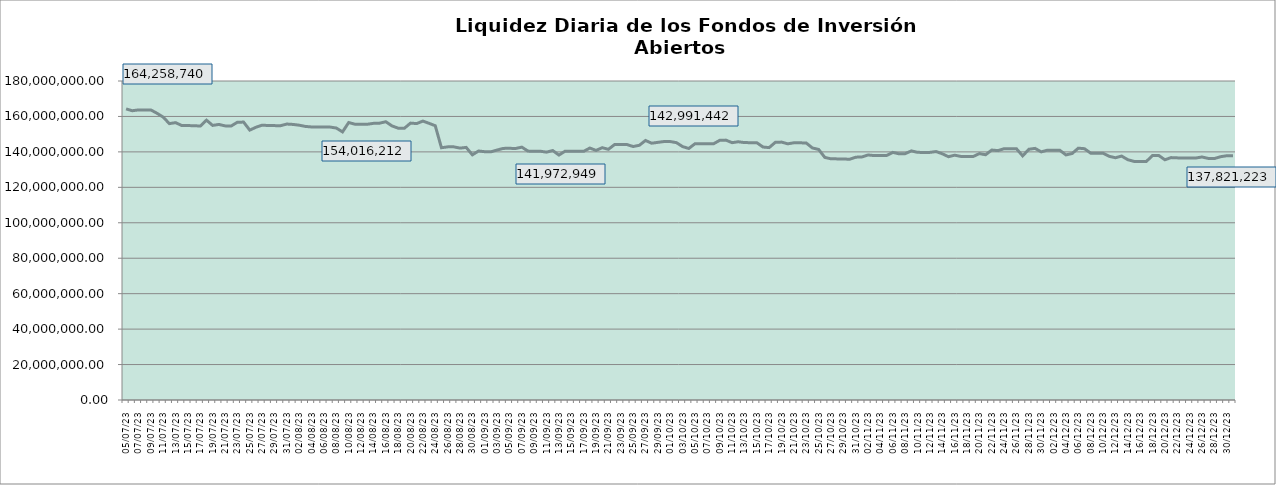
| Category | Series 0 |
|---|---|
| 2023-07-05 | 164258740.45 |
| 2023-07-06 | 163225492.89 |
| 2023-07-07 | 163682937.28 |
| 2023-07-08 | 163691432.8 |
| 2023-07-09 | 163674983.4 |
| 2023-07-10 | 161790090.35 |
| 2023-07-11 | 159601713.99 |
| 2023-07-12 | 155947864.72 |
| 2023-07-13 | 156507464.1 |
| 2023-07-14 | 154883237.61 |
| 2023-07-15 | 154825413.89 |
| 2023-07-16 | 154808876.89 |
| 2023-07-17 | 154556312.68 |
| 2023-07-18 | 157902648.41 |
| 2023-07-19 | 154934355.04 |
| 2023-07-20 | 155498336.32 |
| 2023-07-21 | 154680508.45 |
| 2023-07-22 | 154615108.13 |
| 2023-07-23 | 156728651.41 |
| 2023-07-24 | 156815251.25 |
| 2023-07-25 | 152281694.75 |
| 2023-07-26 | 153890695.42 |
| 2023-07-27 | 155092064.53 |
| 2023-07-28 | 154865658.11 |
| 2023-07-29 | 154820702.95 |
| 2023-07-30 | 154804127.61 |
| 2023-07-31 | 155710217.62 |
| 2023-08-01 | 155493472.47 |
| 2023-08-02 | 155056439.34 |
| 2023-08-03 | 154367288.64 |
| 2023-08-04 | 154063683.76 |
| 2023-08-05 | 154016212.26 |
| 2023-08-06 | 153998460.63 |
| 2023-08-07 | 154003206.59 |
| 2023-08-08 | 153463617.9 |
| 2023-08-09 | 151275983.56 |
| 2023-08-10 | 156557558.49 |
| 2023-08-11 | 155636284.33 |
| 2023-08-12 | 155608232.68 |
| 2023-08-13 | 155591304.7 |
| 2023-08-14 | 156102039.43 |
| 2023-08-15 | 156215343.69 |
| 2023-08-16 | 157010791.53 |
| 2023-08-17 | 154663923.56 |
| 2023-08-18 | 153387856.69 |
| 2023-08-19 | 153314384.31 |
| 2023-08-20 | 156238403.63 |
| 2023-08-21 | 155974720.3 |
| 2023-08-22 | 157393571.5 |
| 2023-08-23 | 156108673.19 |
| 2023-08-24 | 154755827.71 |
| 2023-08-25 | 142339483.8 |
| 2023-08-26 | 142834309.99 |
| 2023-08-27 | 142845396.95 |
| 2023-08-28 | 142129776.63 |
| 2023-08-29 | 142531080.68 |
| 2023-08-30 | 138332190.43 |
| 2023-08-31 | 140499354.46 |
| 2023-09-01 | 140113844.55 |
| 2023-09-02 | 140040873.36 |
| 2023-09-03 | 141051534.51 |
| 2023-09-04 | 141972949.27 |
| 2023-09-05 | 142009197.97 |
| 2023-09-06 | 141922684.19 |
| 2023-09-07 | 142673507.27 |
| 2023-09-08 | 140438336.78 |
| 2023-09-09 | 140378215.04 |
| 2023-09-10 | 140361923.22 |
| 2023-09-11 | 139856330.14 |
| 2023-09-12 | 140755982.43 |
| 2023-09-13 | 138209202.99 |
| 2023-09-14 | 140406022.18 |
| 2023-09-15 | 140376158.96 |
| 2023-09-16 | 140330901.12 |
| 2023-09-17 | 140314549.63 |
| 2023-09-18 | 142177404.36 |
| 2023-09-19 | 140828745.8 |
| 2023-09-20 | 142369430.66 |
| 2023-09-21 | 141452067.91 |
| 2023-09-22 | 144137154.56 |
| 2023-09-23 | 144129136.77 |
| 2023-09-24 | 144140355.03 |
| 2023-09-25 | 143030464.27 |
| 2023-09-26 | 143709526.36 |
| 2023-09-27 | 146442364.41 |
| 2023-09-28 | 144898523.31 |
| 2023-09-29 | 145379884.37 |
| 2023-09-30 | 145846882.75 |
| 2023-10-01 | 145830662.65 |
| 2023-10-02 | 145223175.32 |
| 2023-10-03 | 142991442.49 |
| 2023-10-04 | 141928458.32 |
| 2023-10-05 | 144573166.98 |
| 2023-10-06 | 144583837.61 |
| 2023-10-07 | 144582102.2 |
| 2023-10-08 | 144565903.72 |
| 2023-10-09 | 146507830.64 |
| 2023-10-10 | 146644547.24 |
| 2023-10-11 | 145204706.32 |
| 2023-10-12 | 145714461.06 |
| 2023-10-13 | 145254587.01 |
| 2023-10-14 | 145202166.02 |
| 2023-10-15 | 145186093.08 |
| 2023-10-16 | 142751003.88 |
| 2023-10-17 | 142420672.04 |
| 2023-10-18 | 145405968.76 |
| 2023-10-19 | 145524125.21 |
| 2023-10-20 | 144561548.62 |
| 2023-10-21 | 145143976.13 |
| 2023-10-22 | 145127840.58 |
| 2023-10-23 | 144997720.04 |
| 2023-10-24 | 142203772.79 |
| 2023-10-25 | 141394025.65 |
| 2023-10-26 | 136882533.54 |
| 2023-10-27 | 136093760.43 |
| 2023-10-28 | 136053297.06 |
| 2023-10-29 | 136037251.76 |
| 2023-10-30 | 135806534.56 |
| 2023-10-31 | 137019231.3 |
| 2023-11-01 | 137147206.26 |
| 2023-11-02 | 138254975.75 |
| 2023-11-03 | 137913954.8 |
| 2023-11-04 | 138011079.26 |
| 2023-11-05 | 137994487.41 |
| 2023-11-06 | 139720529.84 |
| 2023-11-07 | 138924336.01 |
| 2023-11-08 | 139010487.17 |
| 2023-11-09 | 140567934.86 |
| 2023-11-10 | 139735186.73 |
| 2023-11-11 | 139704201.44 |
| 2023-11-12 | 139724220.24 |
| 2023-11-13 | 140191854.27 |
| 2023-11-14 | 138926827.83 |
| 2023-11-15 | 137282270.7 |
| 2023-11-16 | 138142908.64 |
| 2023-11-17 | 137442252.96 |
| 2023-11-18 | 137413552.22 |
| 2023-11-19 | 137396889.14 |
| 2023-11-20 | 139040160.06 |
| 2023-11-21 | 138377572.06 |
| 2023-11-22 | 141043509.51 |
| 2023-11-23 | 140715103.37 |
| 2023-11-24 | 141802145.8 |
| 2023-11-25 | 141773249.11 |
| 2023-11-26 | 141757089.47 |
| 2023-11-27 | 137732526.98 |
| 2023-11-28 | 141477123.64 |
| 2023-11-29 | 141974288.97 |
| 2023-11-30 | 140007766.06 |
| 2023-12-01 | 140969519.96 |
| 2023-12-02 | 140928876.61 |
| 2023-12-03 | 140924197.91 |
| 2023-12-04 | 138292399.49 |
| 2023-12-05 | 139089517.65 |
| 2023-12-06 | 142102693.83 |
| 2023-12-07 | 141800672 |
| 2023-12-08 | 139282023.73 |
| 2023-12-09 | 139246490.36 |
| 2023-12-10 | 139230564.54 |
| 2023-12-11 | 137493593.8 |
| 2023-12-12 | 136695207.53 |
| 2023-12-13 | 137647237.96 |
| 2023-12-14 | 135599730.29 |
| 2023-12-15 | 134642918.31 |
| 2023-12-16 | 134594915.42 |
| 2023-12-17 | 134579064.34 |
| 2023-12-18 | 137987669.72 |
| 2023-12-19 | 137995732.42 |
| 2023-12-20 | 135553853.22 |
| 2023-12-21 | 136775176.52 |
| 2023-12-22 | 136623688.08 |
| 2023-12-23 | 136576769.35 |
| 2023-12-24 | 136561308.93 |
| 2023-12-25 | 136545464.64 |
| 2023-12-26 | 137126168.27 |
| 2023-12-27 | 136322562.51 |
| 2023-12-28 | 136241651.59 |
| 2023-12-29 | 137274974.11 |
| 2023-12-30 | 137825488.4 |
| 2023-12-31 | 137821222.69 |